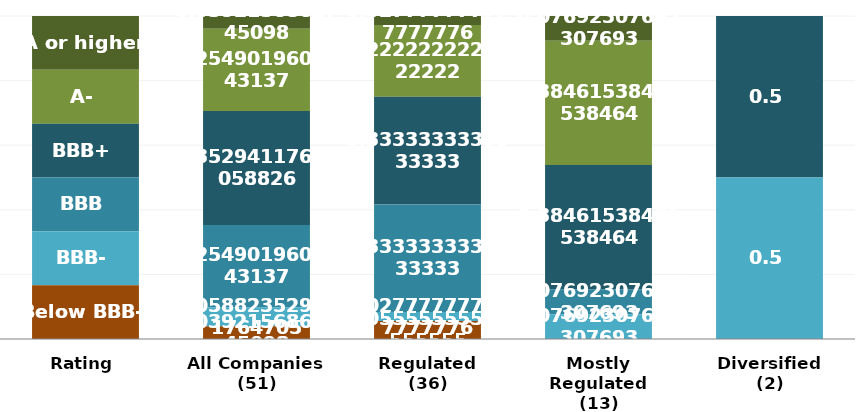
| Category | A or higher | A- | BBB+ | BBB | BBB- | Below BBB- |
|---|---|---|---|---|---|---|
| Rating | 1 | 1 | 1 | 1 | 1 | 1 |
| All Companies
(51) | 2 | 13 | 18 | 13 | 3 | 2 |
| Regulated
(36) | 1 | 8 | 12 | 12 | 1 | 2 |
| Mostly Regulated
(13) | 1 | 5 | 5 | 1 | 1 | 0 |
| Diversified
(2) | 0 | 0 | 1 | 0 | 1 | 0 |